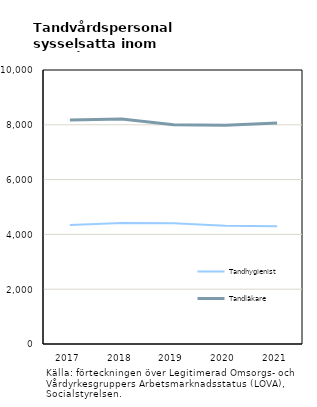
| Category | Tandhygienist | Tandläkare |
|---|---|---|
| 2017.0 | 4345 | 8177 |
| 2018.0 | 4415 | 8213 |
| 2019.0 | 4408 | 8001 |
| 2020.0 | 4312 | 7981 |
| 2021.0 | 4301 | 8066 |